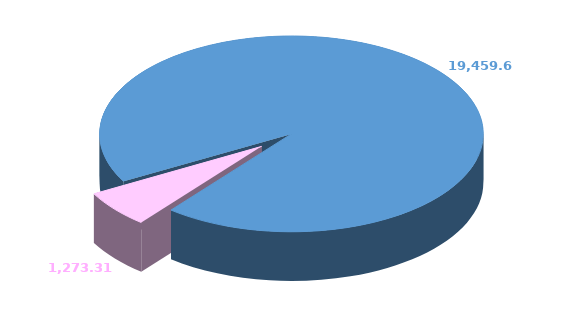
| Category | Series 0 |
|---|---|
| 0 | 19459.641 |
| 1 | 1273.315 |